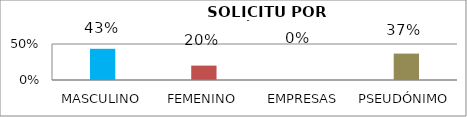
| Category | Series 1 |
|---|---|
| MASCULINO | 0.433 |
| FEMENINO | 0.2 |
| EMPRESAS | 0 |
| PSEUDÓNIMO | 0.367 |